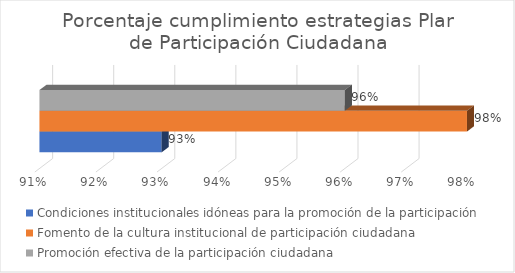
| Category | Condiciones institucionales idóneas para la promoción de la participación  | Fomento de la cultura institucional de participación ciudadana | Promoción efectiva de la participación ciudadana  |
|---|---|---|---|
| 0 | 0.93 | 0.98 | 0.96 |